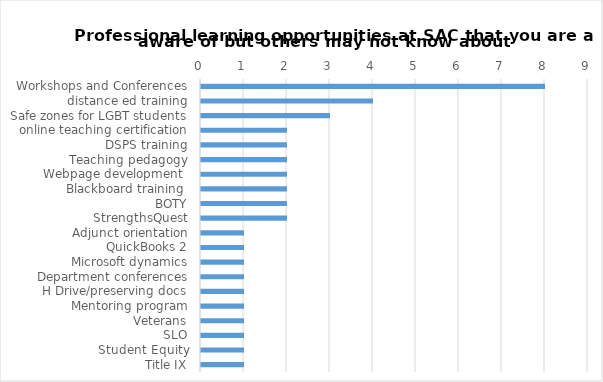
| Category | Series 0 |
|---|---|
| Workshops and Conferences | 8 |
| distance ed training | 4 |
| Safe zones for LGBT students | 3 |
| online teaching certification | 2 |
| DSPS training | 2 |
| Teaching pedagogy | 2 |
| Webpage development  | 2 |
| Blackboard training  | 2 |
| BOTY | 2 |
| StrengthsQuest | 2 |
| Adjunct orientation | 1 |
| QuickBooks 2 | 1 |
| Microsoft dynamics | 1 |
| Department conferences | 1 |
| H Drive/preserving docs | 1 |
| Mentoring program | 1 |
| Veterans | 1 |
| SLO | 1 |
| Student Equity | 1 |
| Title IX | 1 |